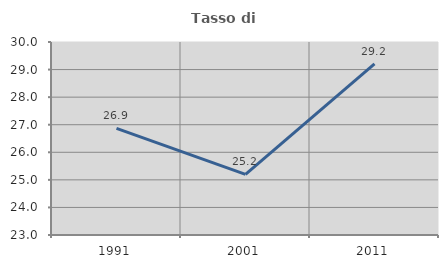
| Category | Tasso di occupazione   |
|---|---|
| 1991.0 | 26.867 |
| 2001.0 | 25.201 |
| 2011.0 | 29.208 |